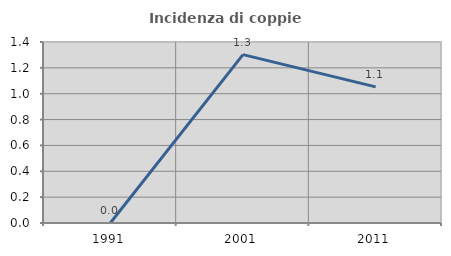
| Category | Incidenza di coppie miste |
|---|---|
| 1991.0 | 0 |
| 2001.0 | 1.302 |
| 2011.0 | 1.053 |